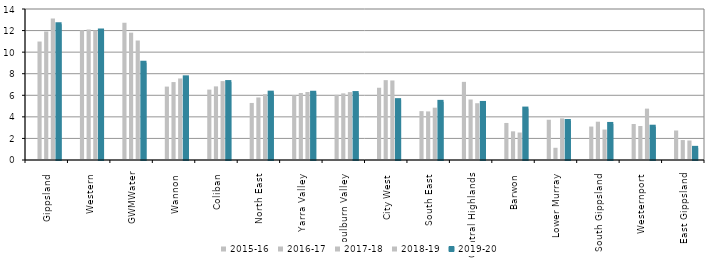
| Category | 2015-16 | 2016-17 | 2017-18 | 2018-19 | 2019-20 |
|---|---|---|---|---|---|
| Gippsland  | 0 | 10.984 | 11.915 | 13.119 | 12.589 |
| Western  | 0 | 12.032 | 12.105 | 12.012 | 12.002 |
| GWMWater | 0 | 12.732 | 11.806 | 11.079 | 9.018 |
| Wannon  | 0 | 6.805 | 7.225 | 7.558 | 7.664 |
| Coliban  | 0 | 6.526 | 6.826 | 7.313 | 7.226 |
| North East  | 0 | 5.289 | 5.8 | 6.102 | 6.244 |
| Yarra Valley  | 0 | 6.003 | 6.211 | 6.306 | 6.234 |
| Goulburn Valley  | 0 | 6.041 | 6.18 | 6.294 | 6.207 |
| City West  | 0 | 6.699 | 7.403 | 7.374 | 5.549 |
| South East  | 0 | 4.53 | 4.505 | 4.851 | 5.391 |
| Central Highlands  | 0 | 7.244 | 5.608 | 5.263 | 5.29 |
| Barwon  | 0 | 3.435 | 2.658 | 2.547 | 4.768 |
| Lower Murray  | 0 | 3.732 | 1.132 | 3.861 | 3.618 |
| South Gippsland  | 0 | 3.1 | 3.551 | 2.824 | 3.343 |
| Westernport  | 0 | 3.336 | 3.151 | 4.764 | 3.086 |
| East Gippsland  | 0 | 2.735 | 1.849 | 1.808 | 1.126 |